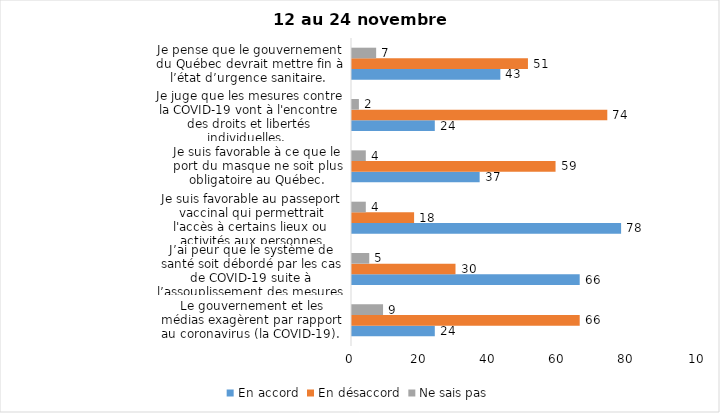
| Category | En accord | En désaccord | Ne sais pas |
|---|---|---|---|
| Le gouvernement et les médias exagèrent par rapport au coronavirus (la COVID-19). | 24 | 66 | 9 |
| J’ai peur que le système de santé soit débordé par les cas de COVID-19 suite à l’assouplissement des mesures | 66 | 30 | 5 |
| Je suis favorable au passeport vaccinal qui permettrait l'accès à certains lieux ou activités aux personnes vaccinées. | 78 | 18 | 4 |
| Je suis favorable à ce que le port du masque ne soit plus obligatoire au Québec. | 37 | 59 | 4 |
| Je juge que les mesures contre la COVID-19 vont à l'encontre des droits et libertés individuelles.  | 24 | 74 | 2 |
| Je pense que le gouvernement du Québec devrait mettre fin à l’état d’urgence sanitaire.  | 43 | 51 | 7 |